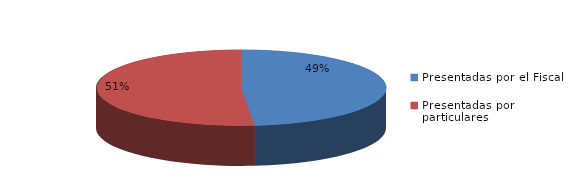
| Category | Series 0 |
|---|---|
| Presentadas por el Fiscal | 131 |
| Presentadas por particulares | 139 |